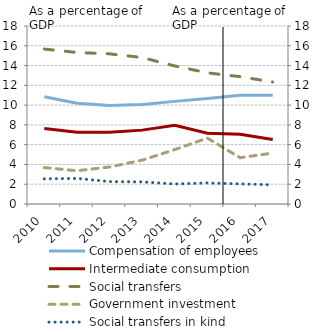
| Category | Compensation of employees | Intermediate consumption | Social transfers | Government investment |
|---|---|---|---|---|
| 2010.0 | 10.853 | 7.625 | 15.667 | 3.681 |
| 2011.0 | 10.189 | 7.266 | 15.324 | 3.362 |
| 2012.0 | 9.954 | 7.266 | 15.184 | 3.743 |
| 2013.0 | 10.072 | 7.471 | 14.812 | 4.433 |
| 2014.0 | 10.378 | 7.967 | 13.957 | 5.505 |
| 2015.0 | 10.664 | 7.148 | 13.264 | 6.66 |
| 2016.0 | 10.992 | 7.049 | 12.878 | 4.678 |
| 2017.0 | 11.007 | 6.531 | 12.342 | 5.153 |